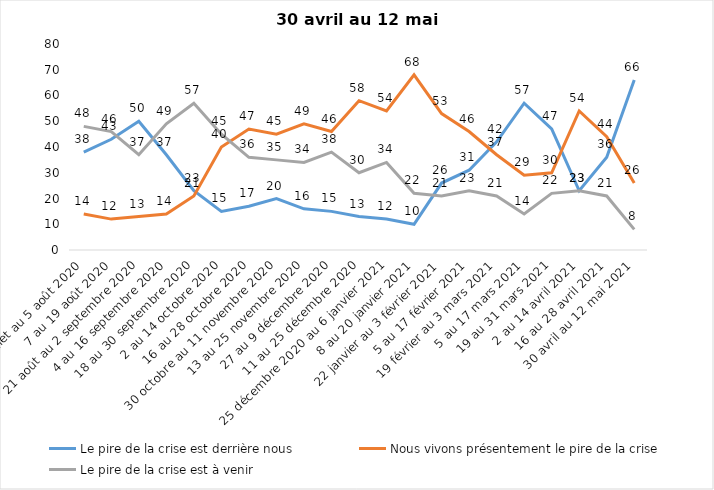
| Category | Le pire de la crise est derrière nous | Nous vivons présentement le pire de la crise | Le pire de la crise est à venir |
|---|---|---|---|
| 24 juillet au 5 août 2020 | 38 | 14 | 48 |
| 7 au 19 août 2020 | 43 | 12 | 46 |
| 21 août au 2 septembre 2020 | 50 | 13 | 37 |
| 4 au 16 septembre 2020 | 37 | 14 | 49 |
| 18 au 30 septembre 2020 | 23 | 21 | 57 |
| 2 au 14 octobre 2020 | 15 | 40 | 45 |
| 16 au 28 octobre 2020 | 17 | 47 | 36 |
| 30 octobre au 11 novembre 2020 | 20 | 45 | 35 |
| 13 au 25 novembre 2020 | 16 | 49 | 34 |
| 27 au 9 décembre 2020 | 15 | 46 | 38 |
| 11 au 25 décembre 2020 | 13 | 58 | 30 |
| 25 décembre 2020 au 6 janvier 2021 | 12 | 54 | 34 |
| 8 au 20 janvier 2021 | 10 | 68 | 22 |
| 22 janvier au 3 février 2021 | 26 | 53 | 21 |
| 5 au 17 février 2021 | 31 | 46 | 23 |
| 19 février au 3 mars 2021 | 42 | 37 | 21 |
| 5 au 17 mars 2021 | 57 | 29 | 14 |
| 19 au 31 mars 2021 | 47 | 30 | 22 |
| 2 au 14 avril 2021 | 23 | 54 | 23 |
| 16 au 28 avril 2021 | 36 | 44 | 21 |
| 30 avril au 12 mai 2021 | 66 | 26 | 8 |